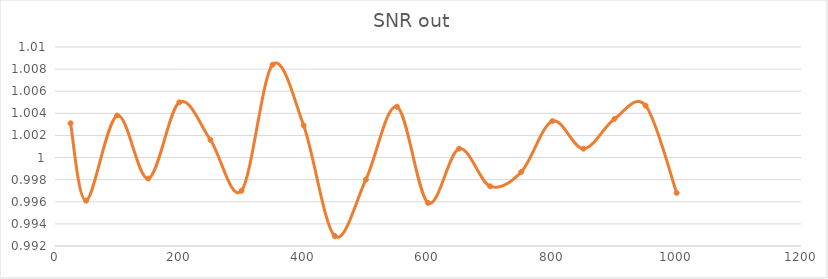
| Category | SNR out |
|---|---|
| 25.0 | 1.003 |
| 50.0 | 0.996 |
| 100.0 | 1.004 |
| 150.0 | 0.998 |
| 200.0 | 1.005 |
| 250.0 | 1.002 |
| 300.0 | 0.997 |
| 350.0 | 1.008 |
| 400.0 | 1.003 |
| 450.0 | 0.993 |
| 500.0 | 0.998 |
| 550.0 | 1.005 |
| 600.0 | 0.996 |
| 650.0 | 1.001 |
| 700.0 | 0.997 |
| 750.0 | 0.999 |
| 800.0 | 1.003 |
| 850.0 | 1.001 |
| 900.0 | 1.004 |
| 950.0 | 1.005 |
| 1000.0 | 0.997 |